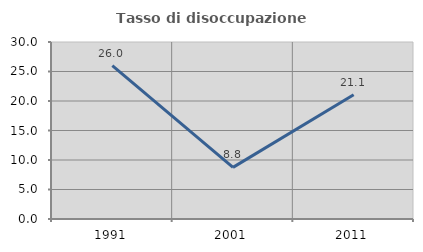
| Category | Tasso di disoccupazione giovanile  |
|---|---|
| 1991.0 | 25.98 |
| 2001.0 | 8.75 |
| 2011.0 | 21.053 |